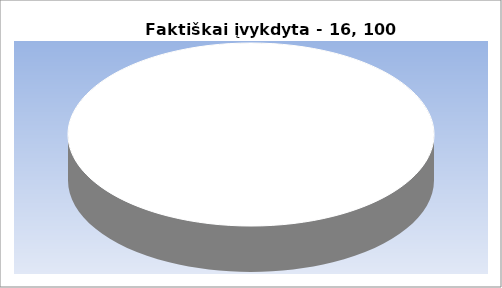
| Category | faktiškai įvykdyta – |
|---|---|
| 0 | 16 |